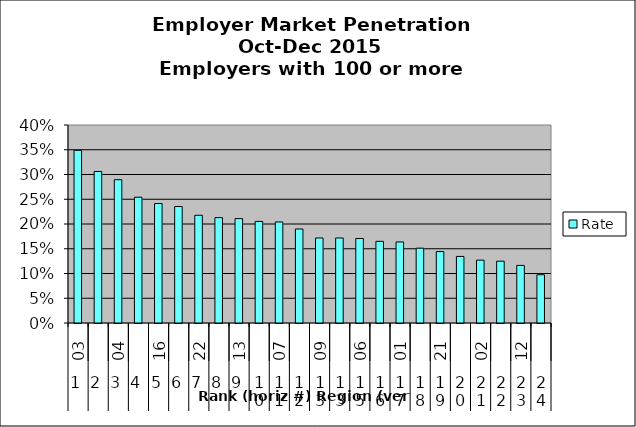
| Category | Rate |
|---|---|
| 0 | 0.349 |
| 1 | 0.306 |
| 2 | 0.289 |
| 3 | 0.254 |
| 4 | 0.241 |
| 5 | 0.235 |
| 6 | 0.218 |
| 7 | 0.213 |
| 8 | 0.211 |
| 9 | 0.205 |
| 10 | 0.204 |
| 11 | 0.19 |
| 12 | 0.172 |
| 13 | 0.172 |
| 14 | 0.171 |
| 15 | 0.165 |
| 16 | 0.164 |
| 17 | 0.151 |
| 18 | 0.144 |
| 19 | 0.134 |
| 20 | 0.127 |
| 21 | 0.125 |
| 22 | 0.116 |
| 23 | 0.097 |